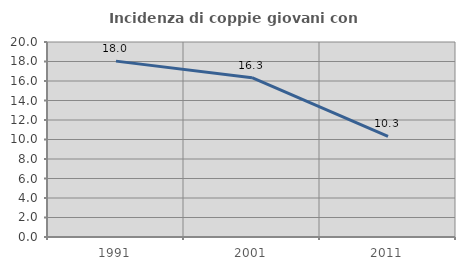
| Category | Incidenza di coppie giovani con figli |
|---|---|
| 1991.0 | 18.039 |
| 2001.0 | 16.342 |
| 2011.0 | 10.332 |